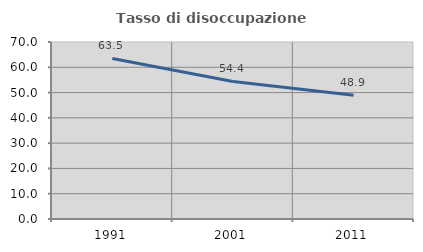
| Category | Tasso di disoccupazione giovanile  |
|---|---|
| 1991.0 | 63.483 |
| 2001.0 | 54.412 |
| 2011.0 | 48.944 |